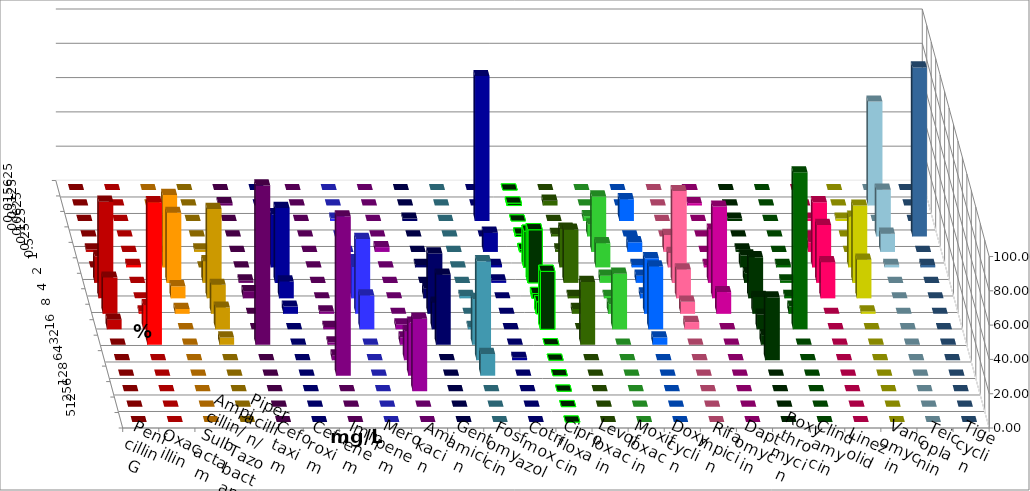
| Category | Penicillin G | Oxacillin | Ampicillin/ Sulbactam | Piperacillin/ Tazobactam | Cefotaxim | Cefuroxim | Imipenem | Meropenem | Amikacin | Gentamicin | Fosfomycin | Cotrimoxazol | Ciprofloxacin | Levofloxacin | Moxifloxacin | Doxycyclin | Rifampicin | Daptomycin | Roxythromycin | Clindamycin | Linezolid | Vancomycin | Teicoplanin | Tigecyclin |
|---|---|---|---|---|---|---|---|---|---|---|---|---|---|---|---|---|---|---|---|---|---|---|---|---|
| 0.015625 | 0 | 0 | 0 | 0 | 0 | 0 | 0 | 0 | 0 | 0 | 0 | 0 | 0 | 0 | 0 | 0 | 0 | 0 | 0 | 0 | 0 | 0 | 0 | 0 |
| 0.03125 | 0 | 0 | 0 | 0 | 1.408 | 0 | 0 | 0 | 0 | 0 | 0 | 0 | 1.408 | 2.817 | 0 | 0 | 0 | 1.408 | 0 | 0 | 0 | 0 | 0 | 60.606 |
| 0.0625 | 0 | 0 | 0 | 0 | 0 | 0 | 1.408 | 1.408 | 0 | 1.408 | 0 | 84.507 | 0 | 0 | 2.817 | 12.676 | 0 | 0 | 1.408 | 0 | 1.408 | 1.408 | 0 | 0 |
| 0.125 | 0 | 0 | 7.042 | 0 | 0 | 0 | 0 | 0 | 0 | 0 | 0 | 0 | 1.408 | 1.408 | 7.042 | 0 | 0 | 0 | 0 | 0 | 0 | 0 | 98.592 | 27.273 |
| 0.25 | 1.408 | 0 | 0 | 1.408 | 0 | 0 | 9.859 | 0 | 2.817 | 0 | 0 | 11.268 | 1.408 | 1.408 | 32.394 | 5.634 | 9.859 | 0 | 1.408 | 0 | 5.634 | 0 | 0 | 10.606 |
| 0.5 | 0 | 1.408 | 42.254 | 0 | 0 | 0 | 30.986 | 4.225 | 0 | 1.408 | 0 | 1.408 | 21.127 | 22.535 | 14.085 | 1.408 | 8.451 | 1.408 | 7.042 | 1.408 | 38.028 | 29.577 | 1.408 | 1.515 |
| 1.0 | 15.493 | 0 | 40.845 | 12.676 | 1.408 | 0 | 43.662 | 12.676 | 0 | 0 | 0 | 1.408 | 30.986 | 30.986 | 4.225 | 4.225 | 53.521 | 30.986 | 5.634 | 1.408 | 33.803 | 45.07 | 0 | 0 |
| 2.0 | 56.338 | 0 | 7.042 | 52.113 | 4.225 | 0 | 9.859 | 18.31 | 0 | 5.634 | 1.408 | 0 | 2.817 | 1.408 | 1.408 | 2.817 | 16.901 | 53.521 | 23.944 | 1.408 | 21.127 | 22.535 | 0 | 0 |
| 4.0 | 21.127 | 1.408 | 2.817 | 16.901 | 0 | 1.408 | 4.225 | 43.662 | 0 | 35.211 | 0 | 0 | 7.042 | 2.817 | 5.634 | 32.394 | 7.042 | 12.676 | 9.859 | 4.225 | 0 | 1.408 | 0 | 0 |
| 8.0 | 5.634 | 14.085 | 0 | 12.676 | 0 | 1.408 | 0 | 19.718 | 2.817 | 15.493 | 1.408 | 0 | 33.803 | 0 | 32.394 | 36.62 | 4.225 | 0 | 8.451 | 91.549 | 0 | 0 | 0 | 0 |
| 16.0 | 0 | 83.099 | 0 | 4.225 | 92.958 | 1.408 | 0 | 0 | 4.225 | 40.845 | 26.761 | 0 | 0 | 36.62 | 0 | 4.225 | 0 | 0 | 5.634 | 0 | 0 | 0 | 0 | 0 |
| 32.0 | 0 | 0 | 0 | 0 | 0 | 2.817 | 0 | 0 | 16.901 | 0 | 57.746 | 1.408 | 0 | 0 | 0 | 0 | 0 | 0 | 36.62 | 0 | 0 | 0 | 0 | 0 |
| 64.0 | 0 | 0 | 0 | 0 | 0 | 92.958 | 0 | 0 | 30.986 | 0 | 12.676 | 0 | 0 | 0 | 0 | 0 | 0 | 0 | 0 | 0 | 0 | 0 | 0 | 0 |
| 128.0 | 0 | 0 | 0 | 0 | 0 | 0 | 0 | 0 | 42.254 | 0 | 0 | 0 | 0 | 0 | 0 | 0 | 0 | 0 | 0 | 0 | 0 | 0 | 0 | 0 |
| 256.0 | 0 | 0 | 0 | 0 | 0 | 0 | 0 | 0 | 0 | 0 | 0 | 0 | 0 | 0 | 0 | 0 | 0 | 0 | 0 | 0 | 0 | 0 | 0 | 0 |
| 512.0 | 0 | 0 | 0 | 0 | 0 | 0 | 0 | 0 | 0 | 0 | 0 | 0 | 0 | 0 | 0 | 0 | 0 | 0 | 0 | 0 | 0 | 0 | 0 | 0 |